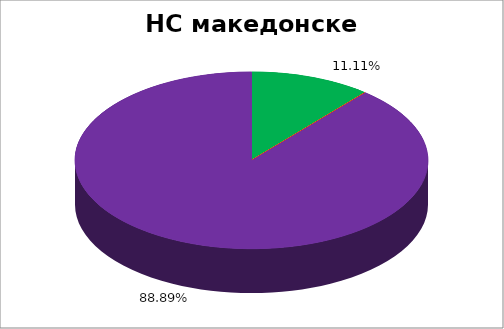
| Category | НС македонске НМ |
|---|---|
| 0 | 0.111 |
| 1 | 0 |
| 2 | 0 |
| 3 | 0 |
| 4 | 0.889 |